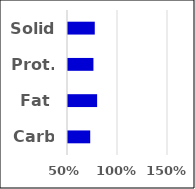
| Category | Value |
|---|---|
| Carb | 0.722 |
| Fat | 0.791 |
| Prot. | 0.754 |
| Solid | 0.768 |